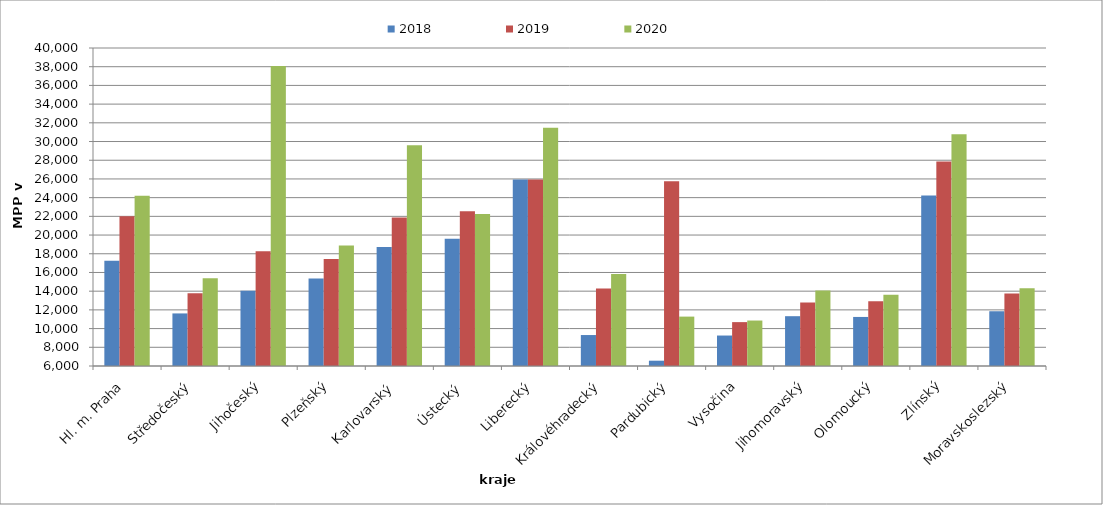
| Category | 2018 | 2019 | 2020 |
|---|---|---|---|
| Hl. m. Praha | 17246.084 | 22007.249 | 24205.518 |
| Středočeský | 11621.091 | 13787.52 | 15372.288 |
| Jihočeský | 14038.549 | 18260.336 | 38065.64 |
| Plzeňský | 15367.579 | 17431.579 | 18870.568 |
| Karlovarský  | 18733.333 | 21866.667 | 29600 |
| Ústecký   | 19607.702 | 22548.82 | 22244.735 |
| Liberecký | 25947.719 | 25947.719 | 31466.21 |
| Královéhradecký | 9310.546 | 14273.684 | 15843.98 |
| Pardubický | 6567.12 | 25740.36 | 11281.241 |
| Vysočina | 9257.311 | 10692.168 | 10860.759 |
| Jihomoravský | 11325.682 | 12789.464 | 14071.496 |
| Olomoucký | 11245.074 | 12931.874 | 13624.03 |
| Zlínský | 24233.677 | 27857.832 | 30785.101 |
| Moravskoslezský | 11854.79 | 13750.588 | 14300.383 |